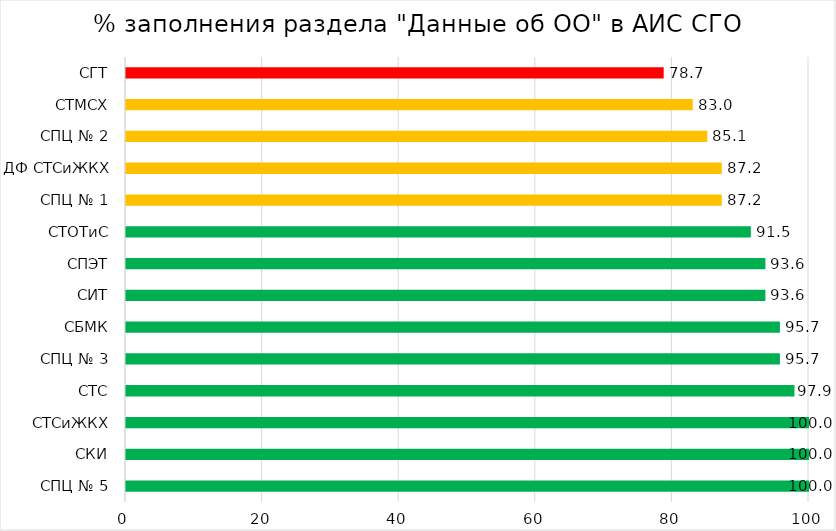
| Category | Series 0 |
|---|---|
| СПЦ № 5 | 100 |
| СКИ | 100 |
| СТСиЖКХ | 100 |
| СТС | 97.872 |
| СПЦ № 3 | 95.745 |
| СБМК | 95.745 |
| СИТ | 93.617 |
| СПЭТ | 93.617 |
| СТОТиС | 91.489 |
| СПЦ № 1 | 87.234 |
| ДФ СТСиЖКХ | 87.234 |
| СПЦ № 2 | 85.106 |
| СТМСХ | 82.979 |
| СГТ | 78.723 |